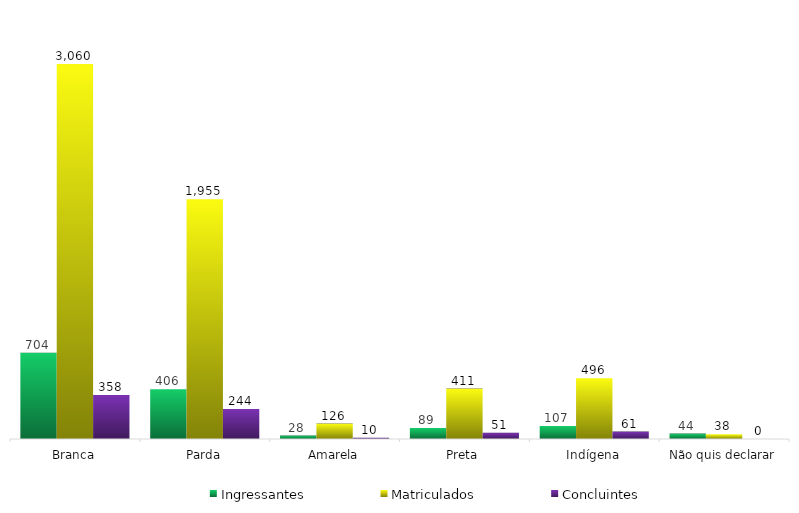
| Category | Ingressantes | Matriculados | Concluintes |
|---|---|---|---|
| Branca | 704 | 3060 | 358 |
| Parda | 406 | 1955 | 244 |
| Amarela | 28 | 126 | 10 |
| Preta | 89 | 411 | 51 |
| Indígena | 107 | 496 | 61 |
| Não quis declarar | 44 | 38 | 0 |